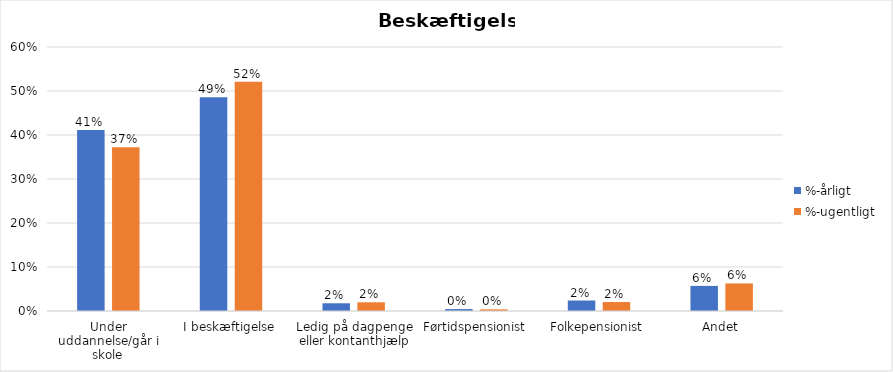
| Category | %-årligt | %-ugentligt |
|---|---|---|
| Under uddannelse/går i skole | 0.411 | 0.372 |
| I beskæftigelse | 0.486 | 0.521 |
| Ledig på dagpenge eller kontanthjælp | 0.018 | 0.02 |
| Førtidspensionist | 0.004 | 0.004 |
| Folkepensionist | 0.024 | 0.02 |
| Andet | 0.057 | 0.063 |